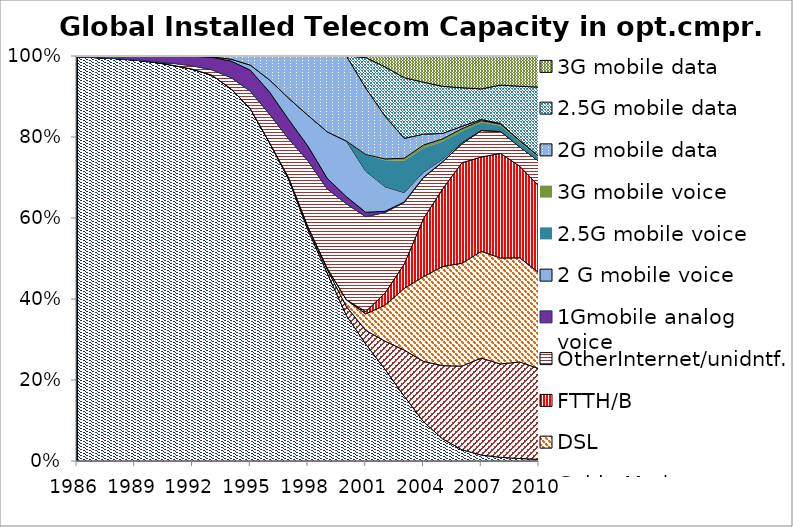
| Category | Fixed-line phone | Cable Modem | DSL | FTTH/B | OtherInternet/unidntf. | 1Gmobile analog voice | 2 G mobile voice | 2.5G mobile voice | 3G mobile voice | 2G mobile data | 2.5G mobile data | 3G mobile data |
|---|---|---|---|---|---|---|---|---|---|---|---|---|
| 1986.0 | 7513954539 | 0 | 0 | 0 | 98776 | 18361070 | 0 | 0 | 0 | 0 | 0 | 0 |
| 1987.0 | 8041343681 | 0 | 0 | 0 | 194896 | 32069563 | 0 | 0 | 0 | 0 | 0 | 0 |
| 1988.0 | 8666936976 | 0 | 0 | 0 | 939764 | 54254078 | 0 | 0 | 0 | 0 | 0 | 0 |
| 1989.0 | 9355572872 | 0 | 0 | 0 | 3554796 | 91913424 | 0 | 0 | 0 | 0 | 0 | 0 |
| 1990.0 | 10114641260 | 0 | 0 | 0 | 16555402 | 139413983 | 0 | 0 | 0 | 0 | 0 | 0 |
| 1991.0 | 10853551415 | 0 | 0 | 0 | 53887403 | 202498099 | 0 | 0 | 0 | 0 | 0 | 0 |
| 1992.0 | 11713983521 | 0 | 0 | 0 | 100199253 | 286606326 | 2600000 | 0 | 0 | 3903030 | 0 | 0 |
| 1993.0 | 12720565951 | 0 | 0 | 0 | 176404510 | 407508429 | 18200000 | 0 | 0 | 27321212 | 0 | 0 |
| 1994.0 | 13997252153 | 0 | 0 | 0 | 419919857 | 620440231 | 72300000 | 0 | 0 | 118986667 | 0 | 0 |
| 1995.0 | 15342913018 | 0 | 0 | 0 | 759519253 | 915709985 | 217760000 | 0 | 0 | 395934546 | 0 | 0 |
| 1996.0 | 16831995581 | 0 | 2148517 | 0 | 1506443117 | 1172017388 | 637469549 | 0 | 0 | 1263383030 | 0 | 0 |
| 1997.0 | 18404252158 | 99960580 | 14898154 | 0 | 2544830478 | 1263686874 | 1397851958 | 0 | 0 | 2768252122 | 0 | 0 |
| 1998.0 | 19692168137 | 221042279 | 57827324 | 0 | 5624238863 | 1244868245 | 2632640227 | 0 | 0 | 5066746667 | 0 | 0 |
| 1999.0 | 21431464306 | 433513521 | 126165953 | 0 | 9058731766 | 1200664702 | 5303940754 | 0 | 0 | 8659486061 | 0 | 0 |
| 2000.0 | 23321804421 | 1419746955 | 1112142409 | 0 | 15381923139 | 1139079171 | 8931938451 | 0 | 0 | 13659753516 | 0 | 0 |
| 2001.0 | 24890238212 | 2932518589 | 3498255140 | 497213882 | 20196245135 | 943960298 | 8749031178 | 3514487406 | 41395350 | 14148386175 | 6488109167 | 338626413 |
| 2002.0 | 26188182064 | 8005785001 | 10263601803 | 3451427515 | 23002689184 | 333338238 | 7034945900 | 7531014836 | 375484354 | 12253572179 | 14023911403 | 3103801830 |
| 2003.0 | 27557638149 | 19685354530 | 26245631335 | 10361736029 | 26216593451 | 201980998 | 3980611652 | 13586676897 | 1063721987 | 8468439091 | 25825424542 | 9232144871 |
| 2004.0 | 29282043403 | 44868183738 | 63069616903 | 43198166275 | 30576166821 | 137650355 | 3845220411 | 17972331610 | 2160434293 | 8110132946 | 38696626795 | 19491807492 |
| 2005.0 | 30287922759 | 101023737849 | 136728923828 | 106975409759 | 37165031777 | 97669834 | 3639390770 | 23995058560 | 3906217828 | 7388530854 | 64847525579 | 41792632360 |
| 2006.0 | 30469186934 | 226552381295 | 278172195991 | 272132615196 | 51649663341 | 66160092 | 3602001898 | 30393543307 | 6412365763 | 6600674539 | 104270491081 | 85893029048 |
| 2007.0 | 30315484993 | 490449818869 | 540327775951 | 476836908491 | 133853524996 | 35076919 | 3713778974 | 37003679213 | 9348855554 | 5919966101 | 154855257640 | 166517063970 |
| 2008.0 | 30338367827 | 779136253295 | 884309498405 | 872815181386 | 184089401232 | 4003662 | 2735196091 | 46103556292 | 11881382930 | 4214374085 | 320913889036 | 242777722871 |
| 2009.0 | 29759028486 | 1136877441907 | 1226131883772 | 1078053843492 | 227192152205 | 124544 | 3022845327 | 53745523493 | 15092888662 | 4262297009 | 638103051620 | 356317327535 |
| 2010.0 | 29221592452 | 1620831968183 | 1714572654845 | 1544198321302 | 446866376751 | 0 | 3436788698 | 59985583556 | 20076308037 | 4551428075 | 1239273121719 | 556106041313 |